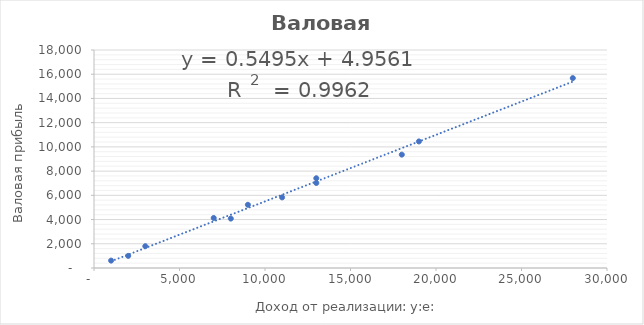
| Category | Series 0 |
|---|---|
| 2000.0 | 1000 |
| 8000.0 | 4080 |
| 18000.0 | 9360 |
| 11000.0 | 5830 |
| 13000.0 | 7020 |
| 19000.0 | 10450 |
| 28000.0 | 15680 |
| 13000.0 | 7410 |
| 9000.0 | 5220 |
| 7000.0 | 4130 |
| 3000.0 | 1800 |
| 1000.0 | 610 |